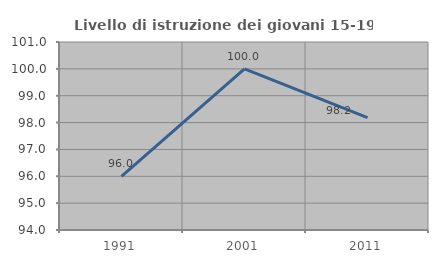
| Category | Livello di istruzione dei giovani 15-19 anni |
|---|---|
| 1991.0 | 96 |
| 2001.0 | 100 |
| 2011.0 | 98.182 |